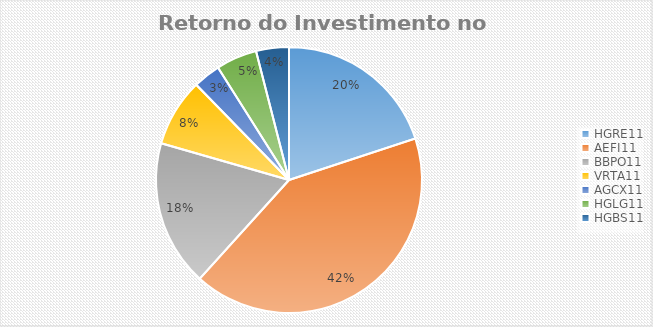
| Category | Series 0 |
|---|---|
| HGRE11 | 0.255 |
| AEFI11 | 0.535 |
| BBPO11 | 0.227 |
| VRTA11 | -0.106 |
| AGCX11 | 0.043 |
| HGLG11 | 0.064 |
| HGBS11 | 0.051 |